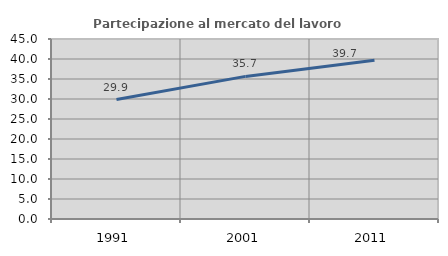
| Category | Partecipazione al mercato del lavoro  femminile |
|---|---|
| 1991.0 | 29.861 |
| 2001.0 | 35.651 |
| 2011.0 | 39.709 |